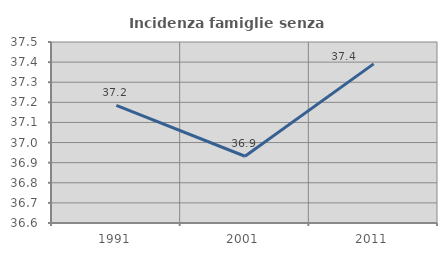
| Category | Incidenza famiglie senza nuclei |
|---|---|
| 1991.0 | 37.185 |
| 2001.0 | 36.932 |
| 2011.0 | 37.391 |